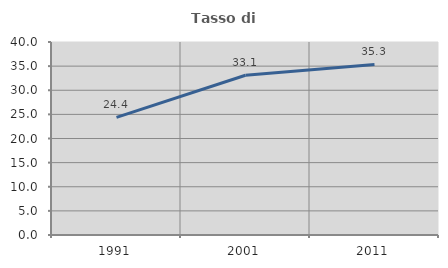
| Category | Tasso di occupazione   |
|---|---|
| 1991.0 | 24.39 |
| 2001.0 | 33.103 |
| 2011.0 | 35.338 |